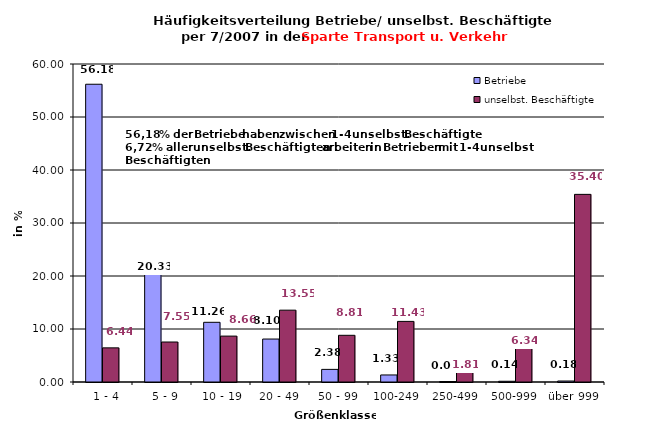
| Category | Betriebe | unselbst. Beschäftigte |
|---|---|---|
|   1 - 4 | 56.181 | 6.444 |
|   5 - 9 | 20.33 | 7.546 |
|  10 - 19 | 11.264 | 8.659 |
| 20 - 49 | 8.104 | 13.554 |
| 50 - 99 | 2.381 | 8.811 |
| 100-249 | 1.328 | 11.434 |
| 250-499 | 0.092 | 1.812 |
| 500-999 | 0.137 | 6.336 |
| über 999 | 0.183 | 35.403 |